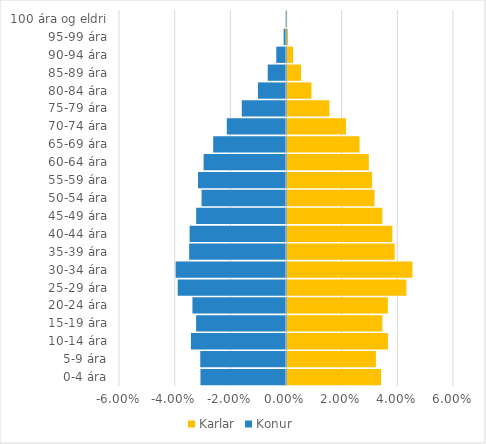
| Category | Karlar | Konur |
|---|---|---|
| 0-4 ára | 0.034 | -0.031 |
| 5-9 ára | 0.032 | -0.031 |
| 10-14 ára | 0.036 | -0.034 |
| 15-19 ára | 0.034 | -0.032 |
| 20-24 ára | 0.036 | -0.034 |
| 25-29 ára | 0.043 | -0.039 |
| 30-34 ára | 0.045 | -0.04 |
| 35-39 ára | 0.039 | -0.035 |
| 40-44 ára | 0.038 | -0.035 |
| 45-49 ára | 0.034 | -0.032 |
| 50-54 ára | 0.031 | -0.03 |
| 55-59 ára | 0.031 | -0.032 |
| 60-64 ára | 0.029 | -0.03 |
| 65-69 ára | 0.026 | -0.026 |
| 70-74 ára | 0.021 | -0.021 |
| 75-79 ára | 0.015 | -0.016 |
| 80-84 ára | 0.009 | -0.01 |
| 85-89 ára | 0.005 | -0.007 |
| 90-94 ára | 0.002 | -0.004 |
| 95-99 ára | 0 | -0.001 |
| 100 ára og eldri | 0 | 0 |